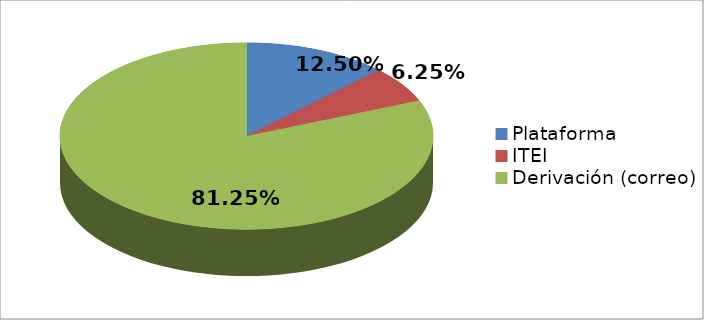
| Category | Series 0 | Series 1 |
|---|---|---|
| Plataforma | 2 | 0.125 |
| ITEI | 1 | 0.062 |
| Derivación (correo) | 13 | 0.812 |